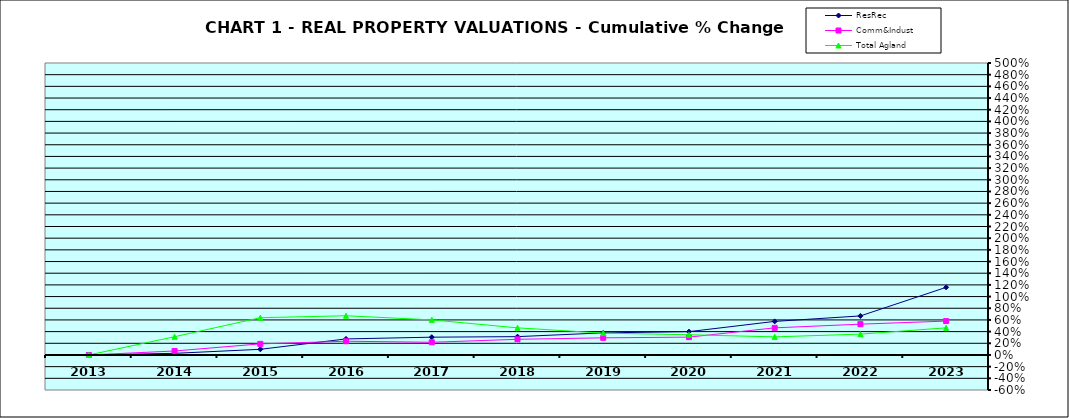
| Category | ResRec | Comm&Indust | Total Agland |
|---|---|---|---|
| 2013.0 | 0 | 0 | 0 |
| 2014.0 | 0.028 | 0.068 | 0.312 |
| 2015.0 | 0.097 | 0.19 | 0.638 |
| 2016.0 | 0.275 | 0.235 | 0.672 |
| 2017.0 | 0.304 | 0.217 | 0.601 |
| 2018.0 | 0.314 | 0.268 | 0.464 |
| 2019.0 | 0.378 | 0.293 | 0.375 |
| 2020.0 | 0.399 | 0.305 | 0.346 |
| 2021.0 | 0.575 | 0.464 | 0.31 |
| 2022.0 | 0.669 | 0.527 | 0.357 |
| 2023.0 | 1.158 | 0.58 | 0.464 |